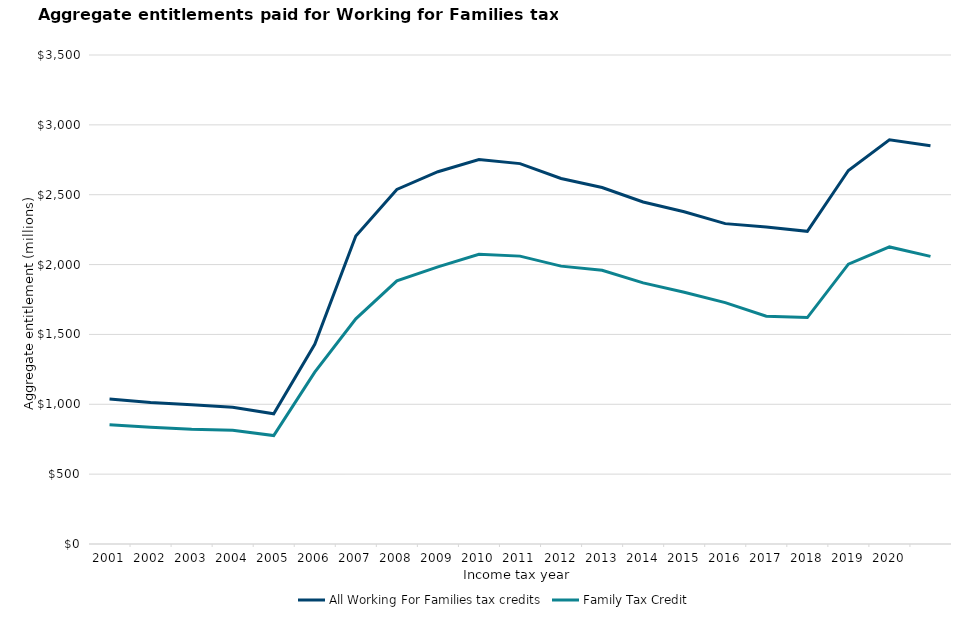
| Category | All Working For Families tax credits | Family Tax Credit |
|---|---|---|
| 2001-03-01 | 1037.1 | 852.9 |
| 2002-03-01 | 1012.6 | 836.4 |
| 2003-03-01 | 997.3 | 821.9 |
| 2004-03-01 | 978.4 | 814.9 |
| 2005-03-01 | 932.2 | 775.9 |
| 2006-03-01 | 1429.7 | 1230.2 |
| 2007-03-01 | 2204.9 | 1611.3 |
| 2008-03-01 | 2537.7 | 1883.5 |
| 2009-03-01 | 2664.4 | 1983.5 |
| 2010-03-01 | 2751.4 | 2073.8 |
| 2011-03-01 | 2722.5 | 2060.5 |
| 2012-03-01 | 2616.5 | 1988.9 |
| 2013-03-01 | 2551.2 | 1959.7 |
| 2014-03-01 | 2448.2 | 1868.7 |
| 2015-03-01 | 2378.1 | 1801.6 |
| 2016-03-01 | 2293.1 | 1728 |
| 2017-03-01 | 2269.3 | 1630.1 |
| 2018-03-01 | 2237.941 | 1620.681 |
| 2019-03-01 | 2673.1 | 2002.7 |
| 2020-03-01 | 2893.4 | 2126.3 |
| 2021-03-01 | 2851.1 | 2058.5 |